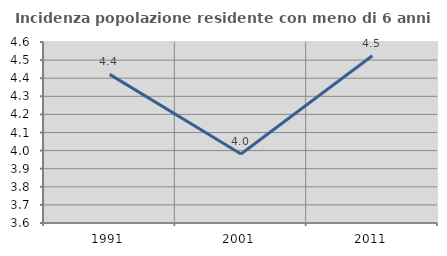
| Category | Incidenza popolazione residente con meno di 6 anni |
|---|---|
| 1991.0 | 4.421 |
| 2001.0 | 3.981 |
| 2011.0 | 4.524 |